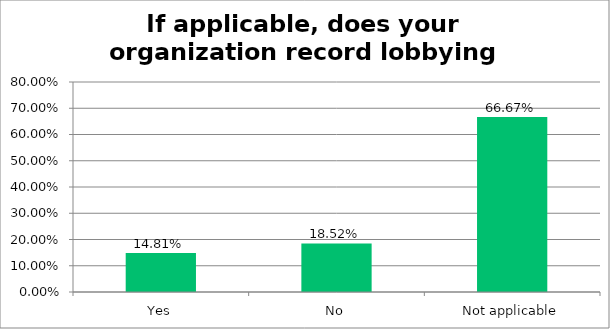
| Category | Responses |
|---|---|
| Yes | 0.148 |
| No | 0.185 |
| Not applicable | 0.667 |